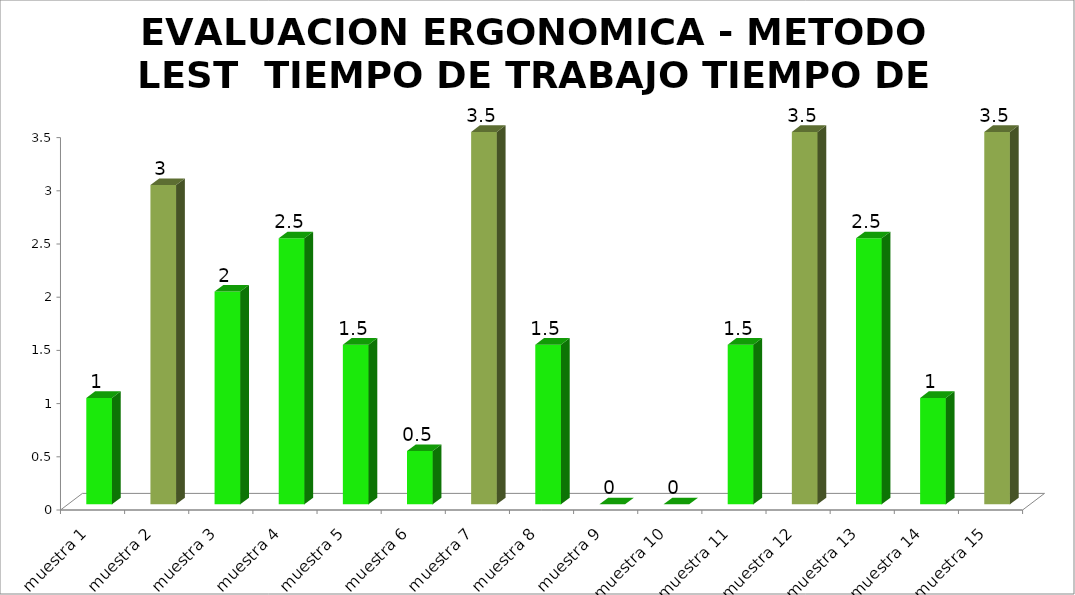
| Category | EVALUACION ERGONOMICA - METODO LEST  |
|---|---|
| muestra 1 | 1 |
| muestra 2 | 3 |
| muestra 3 | 2 |
| muestra 4 | 2.5 |
| muestra 5 | 1.5 |
| muestra 6 | 0.5 |
| muestra 7 | 3.5 |
| muestra 8 | 1.5 |
| muestra 9 | 0 |
| muestra 10 | 0 |
| muestra 11 | 1.5 |
| muestra 12 | 3.5 |
| muestra 13 | 2.5 |
| muestra 14 | 1 |
| muestra 15 | 3.5 |